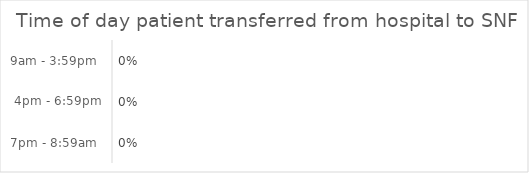
| Category | Series 0 |
|---|---|
| 9am - 3:59pm  | 0 |
| 4pm - 6:59pm | 0 |
| 7pm - 8:59am  | 0 |